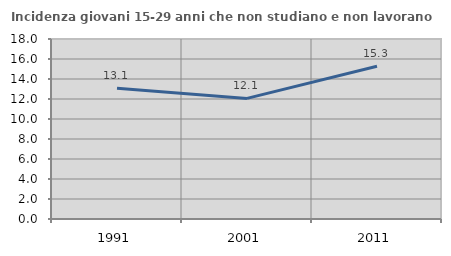
| Category | Incidenza giovani 15-29 anni che non studiano e non lavorano  |
|---|---|
| 1991.0 | 13.073 |
| 2001.0 | 12.06 |
| 2011.0 | 15.267 |